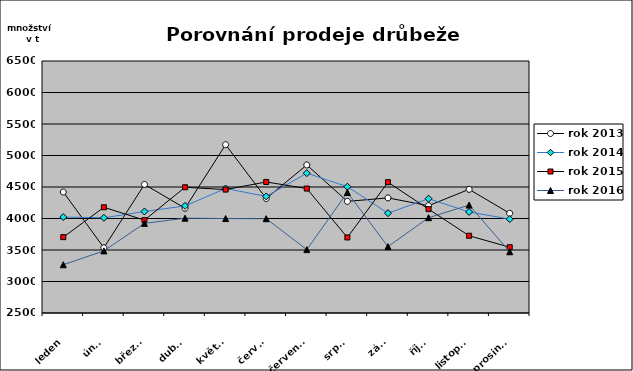
| Category | rok 2013 | rok 2014 | rok 2015 | rok 2016 |
|---|---|---|---|---|
| leden | 4421 | 4023 | 3704 | 3266 |
| únor | 3535 | 4011 | 4178 | 3486 |
| březen | 4541 | 4111 | 3974 | 3923 |
| duben | 4163 | 4200 | 4496 | 4005 |
| květen | 5172 | 4476 | 4459 | 3999 |
| červen | 4317 | 4350 | 4580 | 3997 |
| červenec | 4850 | 4719 | 4475 | 3506 |
| srpen | 4272 | 4505 | 3699 | 4414 |
| září | 4327 | 4085 | 4576 | 3554 |
| říjen | 4203 | 4314 | 4149 | 4013 |
| listopad | 4463 | 4104 | 3726 | 4213 |
| prosinec | 4083 | 3990 | 3544 | 3472 |